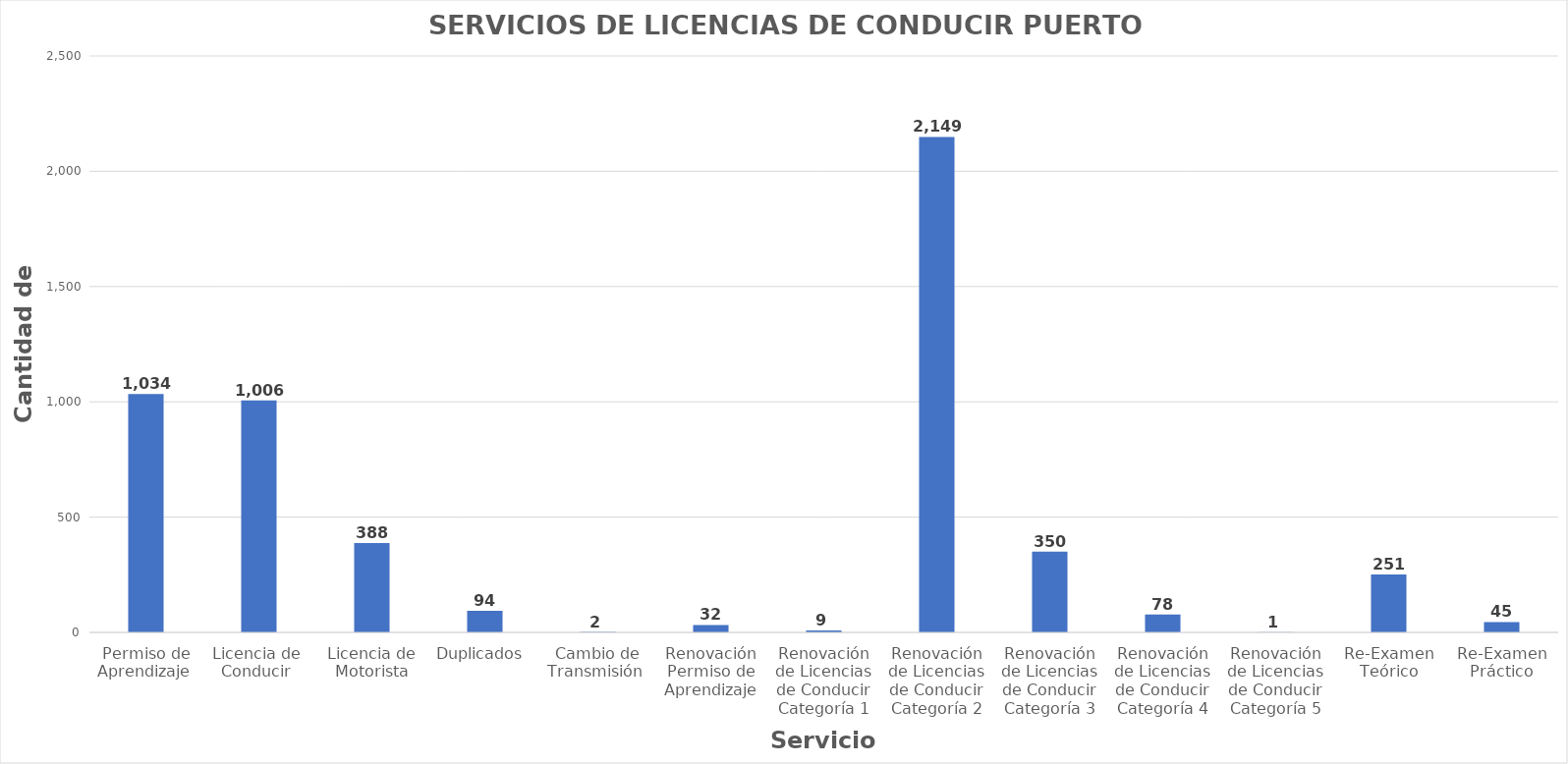
| Category | Series 0 |
|---|---|
| Permiso de Aprendizaje  | 1034 |
| Licencia de  Conducir  | 1006 |
| Licencia de Motorista | 388 |
| Duplicados  | 94 |
| Cambio de Transmisión  | 2 |
| Renovación Permiso de Aprendizaje | 32 |
| Renovación de Licencias de Conducir Categoría 1 | 9 |
| Renovación de Licencias de Conducir Categoría 2 | 2149 |
| Renovación de Licencias de Conducir Categoría 3 | 350 |
| Renovación de Licencias de Conducir Categoría 4 | 78 |
| Renovación de Licencias de Conducir Categoría 5 | 1 |
| Re-Examen Teórico | 251 |
| Re-Examen Práctico | 45 |